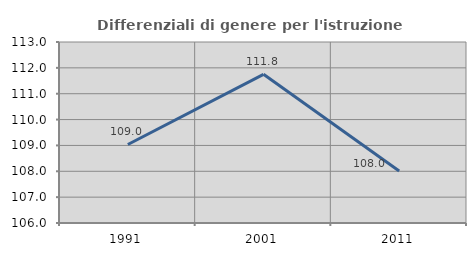
| Category | Differenziali di genere per l'istruzione superiore |
|---|---|
| 1991.0 | 109.037 |
| 2001.0 | 111.751 |
| 2011.0 | 108.013 |